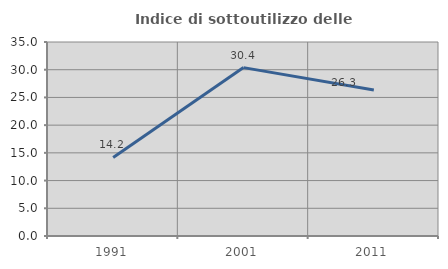
| Category | Indice di sottoutilizzo delle abitazioni  |
|---|---|
| 1991.0 | 14.179 |
| 2001.0 | 30.38 |
| 2011.0 | 26.344 |